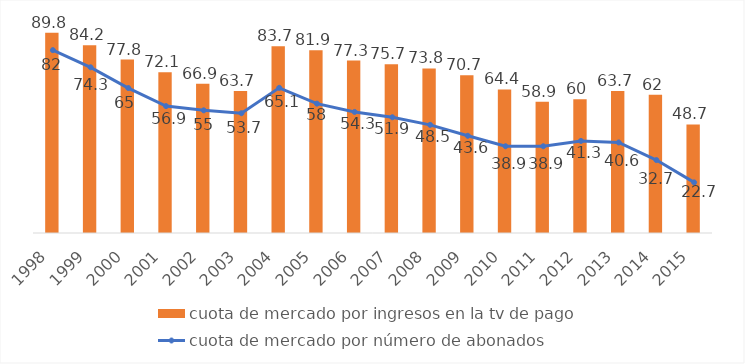
| Category | cuota de mercado por ingresos en la tv de pago  |
|---|---|
| 0 | 89.8 |
| 1 | 84.2 |
| 2 | 77.8 |
| 3 | 72.1 |
| 4 | 66.9 |
| 5 | 63.7 |
| 6 | 83.7 |
| 7 | 81.9 |
| 8 | 77.3 |
| 9 | 75.7 |
| 10 | 73.8 |
| 11 | 70.7 |
| 12 | 64.4 |
| 13 | 58.9 |
| 14 | 60 |
| 15 | 63.7 |
| 16 | 62 |
| 17 | 48.7 |